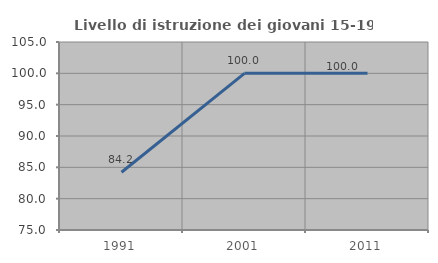
| Category | Livello di istruzione dei giovani 15-19 anni |
|---|---|
| 1991.0 | 84.211 |
| 2001.0 | 100 |
| 2011.0 | 100 |